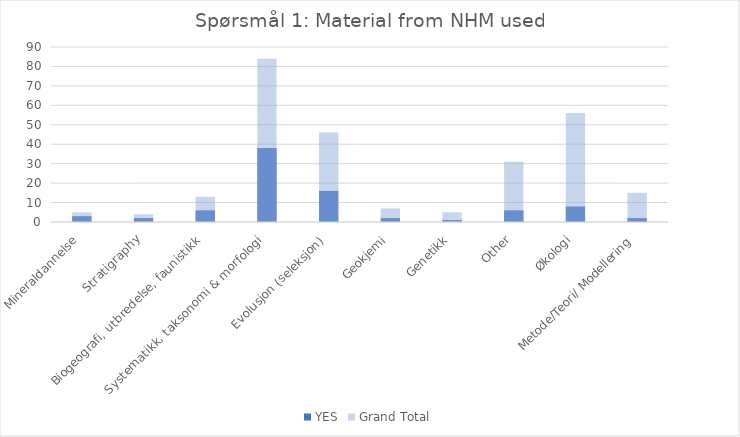
| Category | YES | Grand Total |
|---|---|---|
| Mineraldannelse | 3 | 5 |
| Stratigraphy | 2 | 4 |
| Biogeografi, utbredelse, faunistikk | 6 | 13 |
| Systematikk, taksonomi & morfologi | 38 | 84 |
| Evolusjon (seleksjon) | 16 | 46 |
| Geokjemi | 2 | 7 |
| Genetikk | 1 | 5 |
| Other | 6 | 31 |
| Økologi | 8 | 56 |
| Metode/Teori/ Modellering | 2 | 15 |